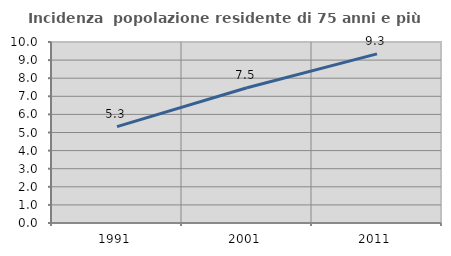
| Category | Incidenza  popolazione residente di 75 anni e più |
|---|---|
| 1991.0 | 5.326 |
| 2001.0 | 7.473 |
| 2011.0 | 9.346 |